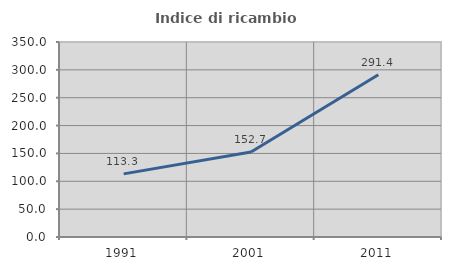
| Category | Indice di ricambio occupazionale  |
|---|---|
| 1991.0 | 113.27 |
| 2001.0 | 152.727 |
| 2011.0 | 291.374 |